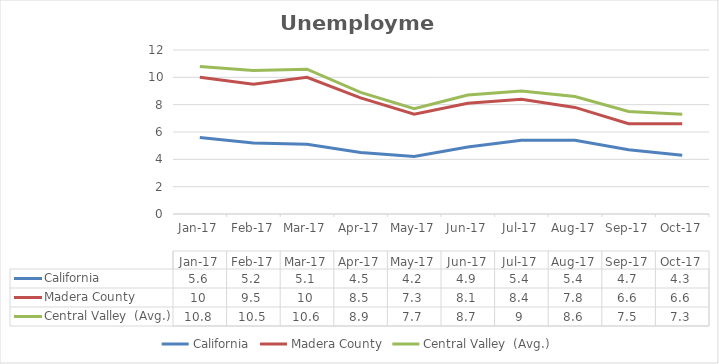
| Category | California | Madera County | Central Valley  (Avg.) |
|---|---|---|---|
| 2017-01-01 | 5.6 | 10 | 10.8 |
| 2017-02-01 | 5.2 | 9.5 | 10.5 |
| 2017-03-01 | 5.1 | 10 | 10.6 |
| 2017-04-01 | 4.5 | 8.5 | 8.9 |
| 2017-05-01 | 4.2 | 7.3 | 7.7 |
| 2017-06-01 | 4.9 | 8.1 | 8.7 |
| 2017-07-01 | 5.4 | 8.4 | 9 |
| 2017-08-01 | 5.4 | 7.8 | 8.6 |
| 2017-09-01 | 4.7 | 6.6 | 7.5 |
| 2017-10-01 | 4.3 | 6.6 | 7.3 |